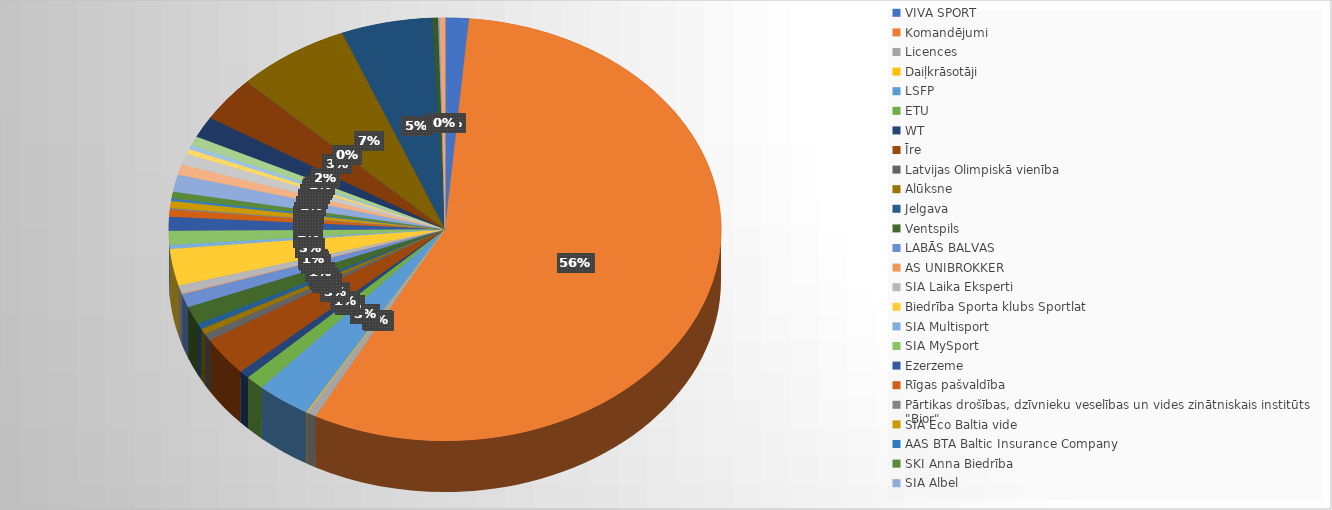
| Category | Series 0 |
|---|---|
| VIVA SPORT | 633.55 |
| Komandējumi | 25827.17 |
| Licences | 246.29 |
| Daiļkrāsotāji | 30.25 |
| LSFP | 1458.67 |
| ETU | 500 |
| WT | 282 |
| Īre | 1350.67 |
| Latvijas Olimpiskā vienība | 250 |
| Alūksne | 200 |
| Jelgava | 200 |
| Ventspils | 631.84 |
| LABĀS BALVAS | 470 |
| AS UNIBROKKER | 30 |
| SIA Laika Eksperti | 280.16 |
| Biedrība Sporta klubs Sportlat | 1286 |
| SIA Multisport | 134.98 |
| SIA MySport | 491.95 |
| Ezerzeme | 490 |
| Rīgas pašvaldība | 248.94 |
| Pārtikas drošības, dzīvnieku veselības un vides zinātniskais institūts "Bior" | 48.02 |
| SIA Eco Baltia vide | 248.95 |
| AAS BTA Baltic Insurance Company | 88.09 |
| SKI Anna Biedrība | 230 |
| SIA Albel | 605 |
| Rīgas Meži SIA | 363 |
| SIA TOI TOI Latvija | 385.39 |
| SIA PELTOR | 181.5 |
| Ceļu satiksmes drošības direkcija VAS | 150.65 |
| Pasākumu tehniskais nodrošinājums SIA | 319.44 |
| SIA Medicīnas sabeidrība ARS | 739.4 |
| MANI APĻI | 1574.93 |
| sia Signs Print | 5 |
| Atalgojums | 3048.96 |
| VID | 2444.08 |
| Charlot | 150.41 |
| VAS "Elektroniskie sakari " | 41.08 |
| Sabiedrība ar ierobežotu atbildību "DIGITĀLĀ PELE" | 145.2 |